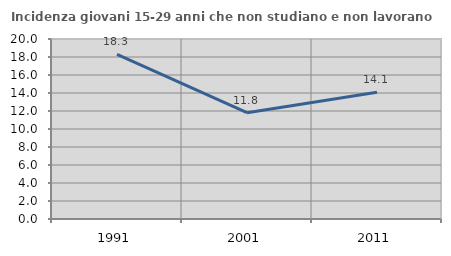
| Category | Incidenza giovani 15-29 anni che non studiano e non lavorano  |
|---|---|
| 1991.0 | 18.284 |
| 2001.0 | 11.81 |
| 2011.0 | 14.082 |